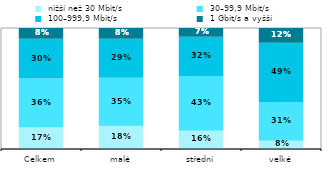
| Category |  nižší než 30 Mbit/s |  30–99,9 Mbit/s |  100–999,9 Mbit/s |  1 Gbit/s a vyšší |
|---|---|---|---|---|
| Celkem | 0.172 | 0.364 | 0.302 | 0.081 |
| malé | 0.18 | 0.352 | 0.29 | 0.081 |
| střední | 0.156 | 0.429 | 0.316 | 0.07 |
| velké | 0.078 | 0.308 | 0.489 | 0.122 |